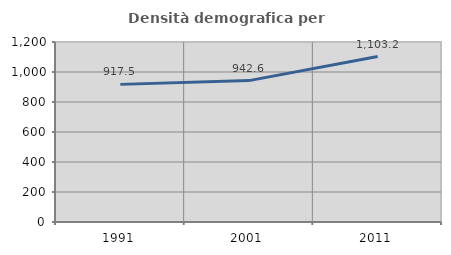
| Category | Densità demografica |
|---|---|
| 1991.0 | 917.504 |
| 2001.0 | 942.591 |
| 2011.0 | 1103.208 |